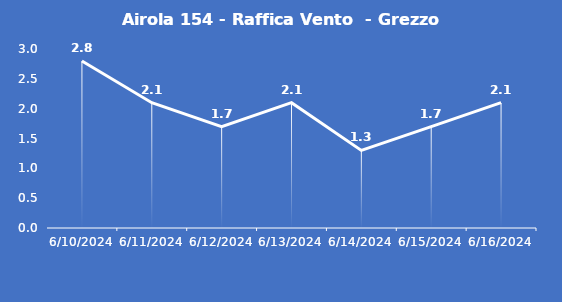
| Category | Airola 154 - Raffica Vento  - Grezzo (m/s) |
|---|---|
| 6/10/24 | 2.8 |
| 6/11/24 | 2.1 |
| 6/12/24 | 1.7 |
| 6/13/24 | 2.1 |
| 6/14/24 | 1.3 |
| 6/15/24 | 1.7 |
| 6/16/24 | 2.1 |